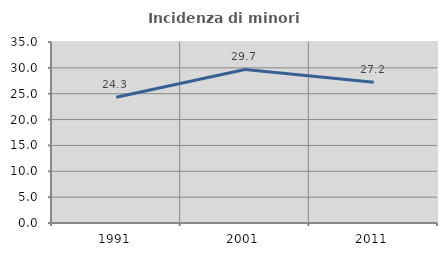
| Category | Incidenza di minori stranieri |
|---|---|
| 1991.0 | 24.324 |
| 2001.0 | 29.694 |
| 2011.0 | 27.203 |